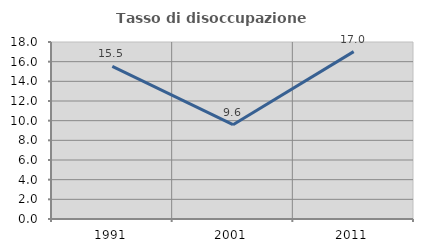
| Category | Tasso di disoccupazione giovanile  |
|---|---|
| 1991.0 | 15.522 |
| 2001.0 | 9.589 |
| 2011.0 | 17.021 |